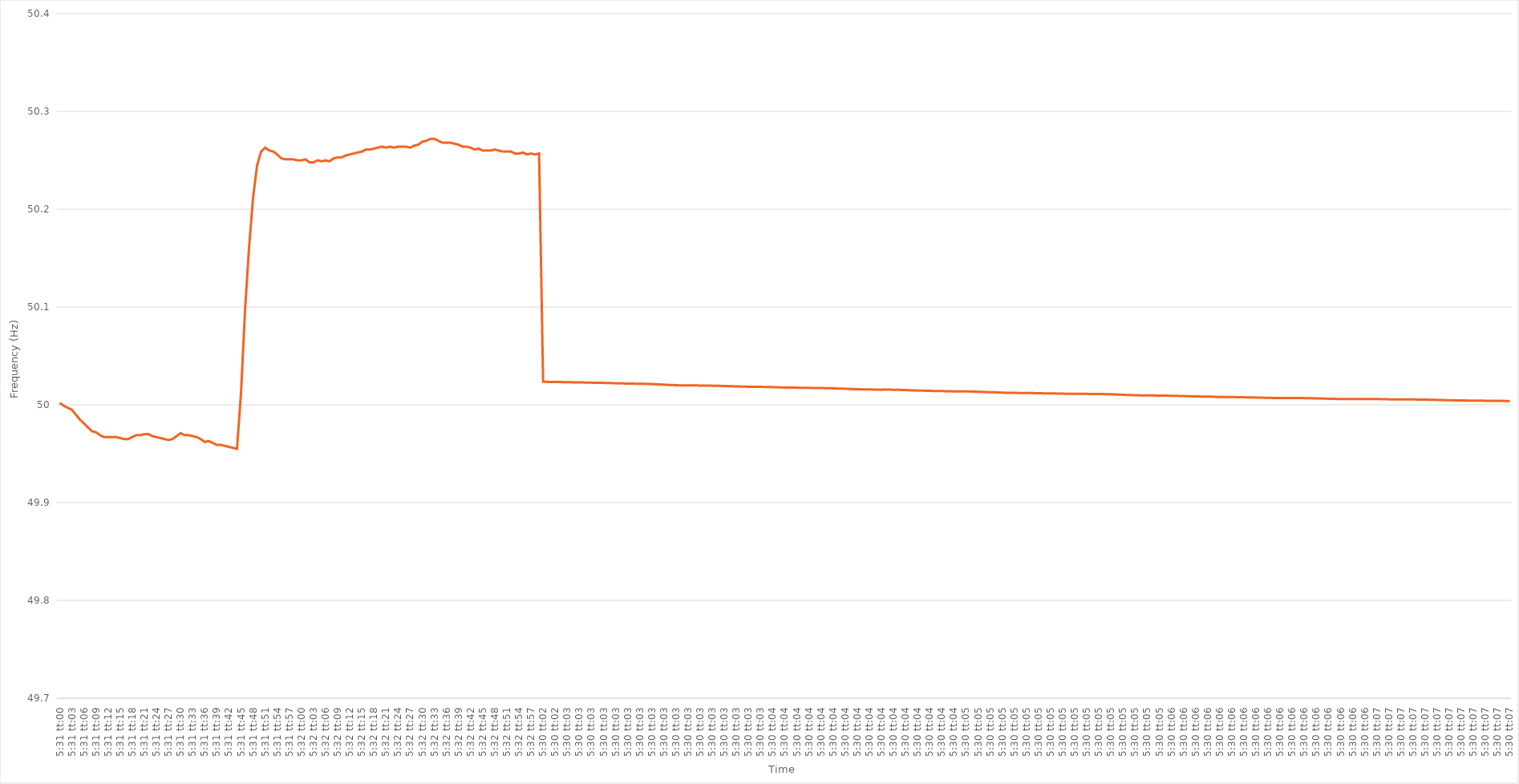
| Category | Series 0 |
|---|---|
| 0.2298611111111111 | 50.002 |
| 0.2298726851851852 | 49.999 |
| 0.22988425925925926 | 49.997 |
| 0.22989583333333333 | 49.995 |
| 0.22990740740740742 | 49.99 |
| 0.2299189814814815 | 49.985 |
| 0.22993055555555555 | 49.981 |
| 0.22994212962962965 | 49.977 |
| 0.22995370370370372 | 49.973 |
| 0.22996527777777778 | 49.972 |
| 0.22997685185185188 | 49.969 |
| 0.22998842592592594 | 49.967 |
| 0.22999999999999998 | 49.967 |
| 0.23001157407407405 | 49.967 |
| 0.23002314814814814 | 49.967 |
| 0.2300347222222222 | 49.966 |
| 0.23004629629629628 | 49.965 |
| 0.23005787037037037 | 49.965 |
| 0.23006944444444444 | 49.967 |
| 0.2300810185185185 | 49.969 |
| 0.2300925925925926 | 49.969 |
| 0.23010416666666667 | 49.97 |
| 0.23011574074074073 | 49.97 |
| 0.23012731481481483 | 49.968 |
| 0.2301388888888889 | 49.967 |
| 0.23015046296296296 | 49.966 |
| 0.23016203703703705 | 49.965 |
| 0.23017361111111112 | 49.964 |
| 0.2301851851851852 | 49.965 |
| 0.23019675925925928 | 49.968 |
| 0.23020833333333335 | 49.971 |
| 0.2302199074074074 | 49.969 |
| 0.2302314814814815 | 49.969 |
| 0.23024305555555555 | 49.968 |
| 0.23025462962962961 | 49.967 |
| 0.23026620370370368 | 49.965 |
| 0.23027777777777778 | 49.962 |
| 0.23028935185185184 | 49.963 |
| 0.2303009259259259 | 49.961 |
| 0.2303125 | 49.959 |
| 0.23032407407407407 | 49.959 |
| 0.23033564814814814 | 49.958 |
| 0.23034722222222223 | 49.957 |
| 0.2303587962962963 | 49.956 |
| 0.23037037037037036 | 49.955 |
| 0.23038194444444446 | 50.012 |
| 0.23039351851851853 | 50.097 |
| 0.2304050925925926 | 50.161 |
| 0.2304166666666667 | 50.212 |
| 0.23042824074074075 | 50.245 |
| 0.23043981481481482 | 50.259 |
| 0.23045138888888891 | 50.263 |
| 0.23046296296296295 | 50.26 |
| 0.23047453703703705 | 50.259 |
| 0.23048611111111109 | 50.256 |
| 0.23049768518518518 | 50.252 |
| 0.23050925925925925 | 50.251 |
| 0.2305208333333333 | 50.251 |
| 0.2305324074074074 | 50.251 |
| 0.23054398148148147 | 50.25 |
| 0.23055555555555554 | 50.25 |
| 0.23056712962962964 | 50.251 |
| 0.2305787037037037 | 50.248 |
| 0.23059027777777777 | 50.248 |
| 0.23060185185185186 | 50.25 |
| 0.23061342592592593 | 50.249 |
| 0.230625 | 50.25 |
| 0.2306365740740741 | 50.249 |
| 0.23064814814814816 | 50.252 |
| 0.23065972222222222 | 50.253 |
| 0.23067129629629632 | 50.253 |
| 0.23068287037037036 | 50.255 |
| 0.23069444444444445 | 50.256 |
| 0.2307060185185185 | 50.257 |
| 0.2307175925925926 | 50.258 |
| 0.23072916666666665 | 50.259 |
| 0.23074074074074072 | 50.261 |
| 0.2307523148148148 | 50.261 |
| 0.23076388888888888 | 50.262 |
| 0.23077546296296295 | 50.263 |
| 0.23078703703703704 | 50.264 |
| 0.2307986111111111 | 50.263 |
| 0.23081018518518517 | 50.264 |
| 0.23082175925925927 | 50.263 |
| 0.23083333333333333 | 50.264 |
| 0.2308449074074074 | 50.264 |
| 0.2308564814814815 | 50.264 |
| 0.23086805555555556 | 50.263 |
| 0.23087962962962963 | 50.265 |
| 0.23089120370370372 | 50.266 |
| 0.2309027777777778 | 50.269 |
| 0.23091435185185186 | 50.27 |
| 0.2309259259259259 | 50.272 |
| 0.23093750000000002 | 50.272 |
| 0.23094907407407406 | 50.27 |
| 0.23096064814814818 | 50.268 |
| 0.23097222222222222 | 50.268 |
| 0.23098379629629628 | 50.268 |
| 0.23099537037037035 | 50.267 |
| 0.23100694444444445 | 50.266 |
| 0.2310185185185185 | 50.264 |
| 0.23103009259259258 | 50.264 |
| 0.23104166666666667 | 50.263 |
| 0.23105324074074074 | 50.261 |
| 0.2310648148148148 | 50.262 |
| 0.2310763888888889 | 50.26 |
| 0.23108796296296297 | 50.26 |
| 0.23109953703703703 | 50.26 |
| 0.23111111111111113 | 50.261 |
| 0.2311226851851852 | 50.26 |
| 0.23113425925925926 | 50.259 |
| 0.23114583333333336 | 50.259 |
| 0.23115740740740742 | 50.259 |
| 0.23116898148148146 | 50.257 |
| 0.23118055555555558 | 50.257 |
| 0.23119212962962962 | 50.258 |
| 0.2312037037037037 | 50.256 |
| 0.23121527777777776 | 50.257 |
| 0.23122685185185185 | 50.256 |
| 0.23123842592592592 | 50.257 |
| 2022-12-02 05:30:02 | 50.024 |
| 2022-12-02 05:30:02 | 50.023 |
| 2022-12-02 05:30:02 | 50.023 |
| 2022-12-02 05:30:02 | 50.023 |
| 2022-12-02 05:30:02 | 50.023 |
| 2022-12-02 05:30:02 | 50.023 |
| 2022-12-02 05:30:02 | 50.023 |
| 2022-12-02 05:30:02 | 50.023 |
| 2022-12-02 05:30:02 | 50.023 |
| 2022-12-02 05:30:02 | 50.023 |
| 2022-12-02 05:30:02 | 50.023 |
| 2022-12-02 05:30:02 | 50.023 |
| 2022-12-02 05:30:02 | 50.023 |
| 2022-12-02 05:30:02 | 50.023 |
| 2022-12-02 05:30:02 | 50.023 |
| 2022-12-02 05:30:02 | 50.022 |
| 2022-12-02 05:30:02 | 50.022 |
| 2022-12-02 05:30:02 | 50.022 |
| 2022-12-02 05:30:02 | 50.022 |
| 2022-12-02 05:30:02 | 50.022 |
| 2022-12-02 05:30:02 | 50.022 |
| 2022-12-02 05:30:02 | 50.022 |
| 2022-12-02 05:30:02 | 50.022 |
| 2022-12-02 05:30:02 | 50.022 |
| 2022-12-02 05:30:02 | 50.022 |
| 2022-12-02 05:30:02 | 50.021 |
| 2022-12-02 05:30:02 | 50.021 |
| 2022-12-02 05:30:02 | 50.021 |
| 2022-12-02 05:30:02 | 50.021 |
| 2022-12-02 05:30:02 | 50.021 |
| 2022-12-02 05:30:03 | 50.021 |
| 2022-12-02 05:30:03 | 50.02 |
| 2022-12-02 05:30:03 | 50.02 |
| 2022-12-02 05:30:03 | 50.02 |
| 2022-12-02 05:30:03 | 50.02 |
| 2022-12-02 05:30:03 | 50.02 |
| 2022-12-02 05:30:03 | 50.02 |
| 2022-12-02 05:30:03 | 50.02 |
| 2022-12-02 05:30:03 | 50.02 |
| 2022-12-02 05:30:03 | 50.02 |
| 2022-12-02 05:30:03 | 50.02 |
| 2022-12-02 05:30:03 | 50.02 |
| 2022-12-02 05:30:03 | 50.02 |
| 2022-12-02 05:30:03 | 50.019 |
| 2022-12-02 05:30:03 | 50.019 |
| 2022-12-02 05:30:03 | 50.019 |
| 2022-12-02 05:30:03 | 50.019 |
| 2022-12-02 05:30:03 | 50.019 |
| 2022-12-02 05:30:03 | 50.019 |
| 2022-12-02 05:30:03 | 50.019 |
| 2022-12-02 05:30:03 | 50.019 |
| 2022-12-02 05:30:03 | 50.019 |
| 2022-12-02 05:30:03 | 50.018 |
| 2022-12-02 05:30:03 | 50.018 |
| 2022-12-02 05:30:03 | 50.018 |
| 2022-12-02 05:30:03 | 50.018 |
| 2022-12-02 05:30:03 | 50.018 |
| 2022-12-02 05:30:03 | 50.018 |
| 2022-12-02 05:30:03 | 50.018 |
| 2022-12-02 05:30:03 | 50.018 |
| 2022-12-02 05:30:03 | 50.018 |
| 2022-12-02 05:30:03 | 50.018 |
| 2022-12-02 05:30:03 | 50.018 |
| 2022-12-02 05:30:03 | 50.018 |
| 2022-12-02 05:30:03 | 50.017 |
| 2022-12-02 05:30:03 | 50.017 |
| 2022-12-02 05:30:03 | 50.017 |
| 2022-12-02 05:30:03 | 50.017 |
| 2022-12-02 05:30:03 | 50.017 |
| 2022-12-02 05:30:03 | 50.017 |
| 2022-12-02 05:30:03 | 50.017 |
| 2022-12-02 05:30:03 | 50.017 |
| 2022-12-02 05:30:03 | 50.017 |
| 2022-12-02 05:30:03 | 50.017 |
| 2022-12-02 05:30:03 | 50.017 |
| 2022-12-02 05:30:03 | 50.016 |
| 2022-12-02 05:30:03 | 50.016 |
| 2022-12-02 05:30:03 | 50.016 |
| 2022-12-02 05:30:03 | 50.016 |
| 2022-12-02 05:30:03 | 50.016 |
| 2022-12-02 05:30:04 | 50.016 |
| 2022-12-02 05:30:04 | 50.016 |
| 2022-12-02 05:30:04 | 50.016 |
| 2022-12-02 05:30:04 | 50.015 |
| 2022-12-02 05:30:04 | 50.015 |
| 2022-12-02 05:30:04 | 50.016 |
| 2022-12-02 05:30:04 | 50.016 |
| 2022-12-02 05:30:04 | 50.015 |
| 2022-12-02 05:30:04 | 50.015 |
| 2022-12-02 05:30:04 | 50.015 |
| 2022-12-02 05:30:04 | 50.015 |
| 2022-12-02 05:30:04 | 50.015 |
| 2022-12-02 05:30:04 | 50.015 |
| 2022-12-02 05:30:04 | 50.015 |
| 2022-12-02 05:30:04 | 50.015 |
| 2022-12-02 05:30:04 | 50.014 |
| 2022-12-02 05:30:04 | 50.014 |
| 2022-12-02 05:30:04 | 50.014 |
| 2022-12-02 05:30:04 | 50.014 |
| 2022-12-02 05:30:04 | 50.014 |
| 2022-12-02 05:30:04 | 50.014 |
| 2022-12-02 05:30:04 | 50.014 |
| 2022-12-02 05:30:04 | 50.014 |
| 2022-12-02 05:30:04 | 50.014 |
| 2022-12-02 05:30:04 | 50.014 |
| 2022-12-02 05:30:04 | 50.014 |
| 2022-12-02 05:30:04 | 50.014 |
| 2022-12-02 05:30:04 | 50.013 |
| 2022-12-02 05:30:04 | 50.013 |
| 2022-12-02 05:30:04 | 50.013 |
| 2022-12-02 05:30:04 | 50.013 |
| 2022-12-02 05:30:04 | 50.013 |
| 2022-12-02 05:30:04 | 50.013 |
| 2022-12-02 05:30:04 | 50.013 |
| 2022-12-02 05:30:04 | 50.012 |
| 2022-12-02 05:30:04 | 50.012 |
| 2022-12-02 05:30:04 | 50.012 |
| 2022-12-02 05:30:04 | 50.012 |
| 2022-12-02 05:30:04 | 50.012 |
| 2022-12-02 05:30:04 | 50.012 |
| 2022-12-02 05:30:04 | 50.012 |
| 2022-12-02 05:30:04 | 50.012 |
| 2022-12-02 05:30:04 | 50.012 |
| 2022-12-02 05:30:04 | 50.012 |
| 2022-12-02 05:30:04 | 50.012 |
| 2022-12-02 05:30:04 | 50.012 |
| 2022-12-02 05:30:04 | 50.012 |
| 2022-12-02 05:30:04 | 50.012 |
| 2022-12-02 05:30:04 | 50.011 |
| 2022-12-02 05:30:04 | 50.011 |
| 2022-12-02 05:30:05 | 50.011 |
| 2022-12-02 05:30:05 | 50.011 |
| 2022-12-02 05:30:05 | 50.011 |
| 2022-12-02 05:30:05 | 50.011 |
| 2022-12-02 05:30:05 | 50.011 |
| 2022-12-02 05:30:05 | 50.011 |
| 2022-12-02 05:30:05 | 50.011 |
| 2022-12-02 05:30:05 | 50.011 |
| 2022-12-02 05:30:05 | 50.011 |
| 2022-12-02 05:30:05 | 50.011 |
| 2022-12-02 05:30:05 | 50.011 |
| 2022-12-02 05:30:05 | 50.011 |
| 2022-12-02 05:30:05 | 50.011 |
| 2022-12-02 05:30:05 | 50.01 |
| 2022-12-02 05:30:05 | 50.01 |
| 2022-12-02 05:30:05 | 50.01 |
| 2022-12-02 05:30:05 | 50.01 |
| 2022-12-02 05:30:05 | 50.01 |
| 2022-12-02 05:30:05 | 50.01 |
| 2022-12-02 05:30:05 | 50.01 |
| 2022-12-02 05:30:05 | 50.01 |
| 2022-12-02 05:30:05 | 50.01 |
| 2022-12-02 05:30:05 | 50.01 |
| 2022-12-02 05:30:05 | 50.009 |
| 2022-12-02 05:30:05 | 50.009 |
| 2022-12-02 05:30:05 | 50.009 |
| 2022-12-02 05:30:05 | 50.009 |
| 2022-12-02 05:30:05 | 50.009 |
| 2022-12-02 05:30:05 | 50.009 |
| 2022-12-02 05:30:05 | 50.009 |
| 2022-12-02 05:30:05 | 50.009 |
| 2022-12-02 05:30:05 | 50.009 |
| 2022-12-02 05:30:05 | 50.009 |
| 2022-12-02 05:30:05 | 50.009 |
| 2022-12-02 05:30:05 | 50.008 |
| 2022-12-02 05:30:05 | 50.008 |
| 2022-12-02 05:30:05 | 50.008 |
| 2022-12-02 05:30:05 | 50.008 |
| 2022-12-02 05:30:05 | 50.008 |
| 2022-12-02 05:30:05 | 50.008 |
| 2022-12-02 05:30:05 | 50.008 |
| 2022-12-02 05:30:05 | 50.008 |
| 2022-12-02 05:30:05 | 50.008 |
| 2022-12-02 05:30:05 | 50.008 |
| 2022-12-02 05:30:05 | 50.008 |
| 2022-12-02 05:30:05 | 50.008 |
| 2022-12-02 05:30:05 | 50.008 |
| 2022-12-02 05:30:05 | 50.007 |
| 2022-12-02 05:30:05 | 50.007 |
| 2022-12-02 05:30:05 | 50.007 |
| 2022-12-02 05:30:06 | 50.007 |
| 2022-12-02 05:30:06 | 50.007 |
| 2022-12-02 05:30:06 | 50.007 |
| 2022-12-02 05:30:06 | 50.007 |
| 2022-12-02 05:30:06 | 50.007 |
| 2022-12-02 05:30:06 | 50.007 |
| 2022-12-02 05:30:06 | 50.007 |
| 2022-12-02 05:30:06 | 50.007 |
| 2022-12-02 05:30:06 | 50.007 |
| 2022-12-02 05:30:06 | 50.007 |
| 2022-12-02 05:30:06 | 50.007 |
| 2022-12-02 05:30:06 | 50.007 |
| 2022-12-02 05:30:06 | 50.007 |
| 2022-12-02 05:30:06 | 50.006 |
| 2022-12-02 05:30:06 | 50.006 |
| 2022-12-02 05:30:06 | 50.006 |
| 2022-12-02 05:30:06 | 50.006 |
| 2022-12-02 05:30:06 | 50.006 |
| 2022-12-02 05:30:06 | 50.006 |
| 2022-12-02 05:30:06 | 50.006 |
| 2022-12-02 05:30:06 | 50.006 |
| 2022-12-02 05:30:06 | 50.006 |
| 2022-12-02 05:30:06 | 50.006 |
| 2022-12-02 05:30:06 | 50.006 |
| 2022-12-02 05:30:06 | 50.006 |
| 2022-12-02 05:30:06 | 50.006 |
| 2022-12-02 05:30:06 | 50.006 |
| 2022-12-02 05:30:06 | 50.006 |
| 2022-12-02 05:30:06 | 50.006 |
| 2022-12-02 05:30:06 | 50.006 |
| 2022-12-02 05:30:06 | 50.006 |
| 2022-12-02 05:30:06 | 50.006 |
| 2022-12-02 05:30:06 | 50.006 |
| 2022-12-02 05:30:06 | 50.005 |
| 2022-12-02 05:30:06 | 50.005 |
| 2022-12-02 05:30:06 | 50.005 |
| 2022-12-02 05:30:06 | 50.005 |
| 2022-12-02 05:30:06 | 50.005 |
| 2022-12-02 05:30:06 | 50.005 |
| 2022-12-02 05:30:06 | 50.005 |
| 2022-12-02 05:30:06 | 50.005 |
| 2022-12-02 05:30:06 | 50.005 |
| 2022-12-02 05:30:06 | 50.005 |
| 2022-12-02 05:30:06 | 50.005 |
| 2022-12-02 05:30:06 | 50.005 |
| 2022-12-02 05:30:06 | 50.005 |
| 2022-12-02 05:30:06 | 50.005 |
| 2022-12-02 05:30:06 | 50.005 |
| 2022-12-02 05:30:06 | 50.004 |
| 2022-12-02 05:30:06 | 50.004 |
| 2022-12-02 05:30:07 | 50.004 |
| 2022-12-02 05:30:07 | 50.004 |
| 2022-12-02 05:30:07 | 50.004 |
| 2022-12-02 05:30:07 | 50.004 |
| 2022-12-02 05:30:07 | 50.004 |
| 2022-12-02 05:30:07 | 50.004 |
| 2022-12-02 05:30:07 | 50.004 |
| 2022-12-02 05:30:07 | 50.004 |
| 2022-12-02 05:30:07 | 50.004 |
| 2022-12-02 05:30:07 | 50.004 |
| 2022-12-02 05:30:07 | 50.004 |